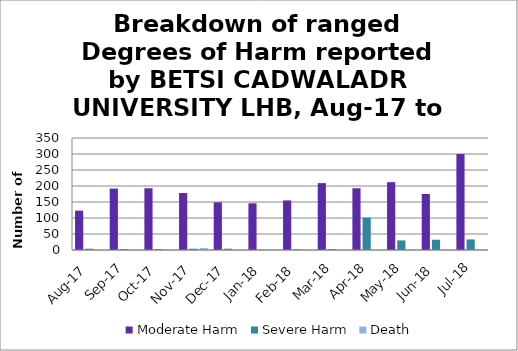
| Category | Moderate Harm | Severe Harm | Death |
|---|---|---|---|
| Aug-17 | 123 | 4 | 0 |
| Sep-17 | 192 | 3 | 1 |
| Oct-17 | 193 | 3 | 1 |
| Nov-17 | 178 | 4 | 6 |
| Dec-17 | 149 | 4 | 1 |
| Jan-18 | 146 | 1 | 2 |
| Feb-18 | 155 | 2 | 1 |
| Mar-18 | 209 | 3 | 0 |
| Apr-18 | 193 | 101 | 1 |
| May-18 | 212 | 30 | 2 |
| Jun-18 | 175 | 32 | 1 |
| Jul-18 | 300 | 33 | 2 |